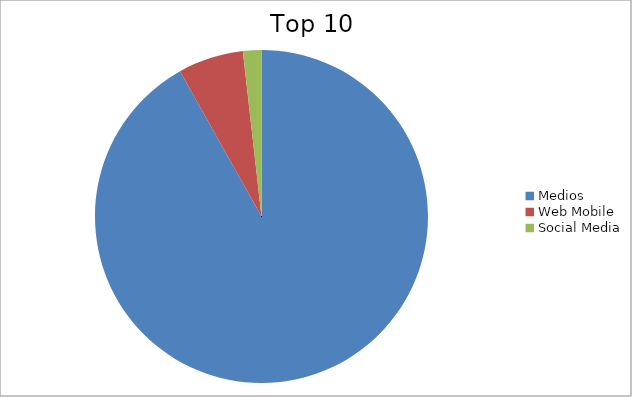
| Category | Series 0 |
|---|---|
| Medios | 91.86 |
| Web Mobile | 6.35 |
| Social Media | 1.79 |